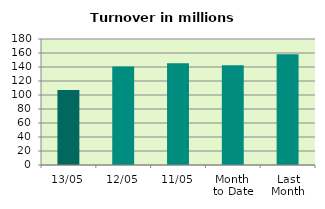
| Category | Series 0 |
|---|---|
| 13/05 | 107.316 |
| 12/05 | 140.689 |
| 11/05 | 145.393 |
| Month 
to Date | 142.491 |
| Last
Month | 158.303 |